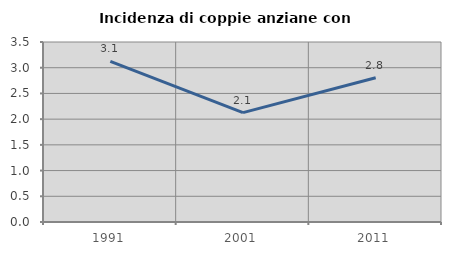
| Category | Incidenza di coppie anziane con figli |
|---|---|
| 1991.0 | 3.125 |
| 2001.0 | 2.128 |
| 2011.0 | 2.804 |